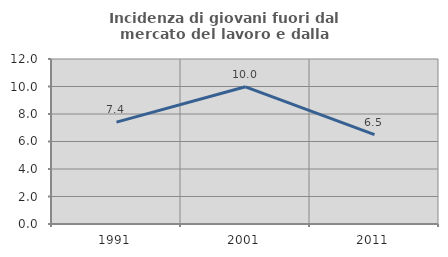
| Category | Incidenza di giovani fuori dal mercato del lavoro e dalla formazione  |
|---|---|
| 1991.0 | 7.407 |
| 2001.0 | 9.977 |
| 2011.0 | 6.494 |